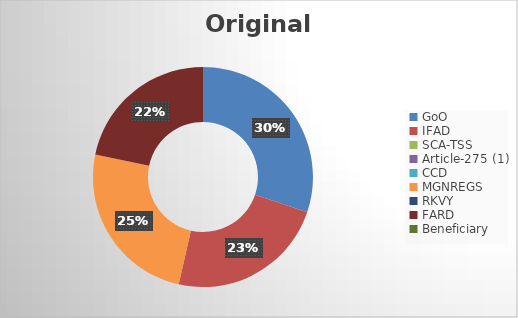
| Category | Original Budget |
|---|---|
| GoO | 104223974.268 |
| IFAD | 80575693.333 |
| SCA-TSS | 0 |
| Article-275 (1) | 0 |
| CCD | 0 |
| MGNREGS | 85321300 |
| RKVY | 0 |
| FARD | 75000000 |
| Beneficiary | 0 |